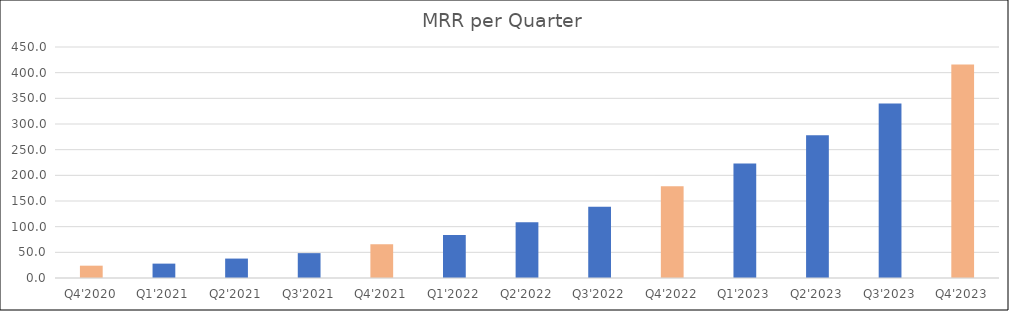
| Category | Series 0 |
|---|---|
| Q4'2020 | 24 |
| Q1'2021 | 28 |
| Q2'2021 | 37.845 |
| Q3'2021 | 48.413 |
| Q4'2021 | 65.749 |
| Q1'2022 | 83.572 |
| Q2'2022 | 108.739 |
| Q3'2022 | 138.662 |
| Q4'2022 | 178.647 |
| Q1'2023 | 222.811 |
| Q2'2023 | 277.899 |
| Q3'2023 | 339.94 |
| Q4'2023 | 416.131 |